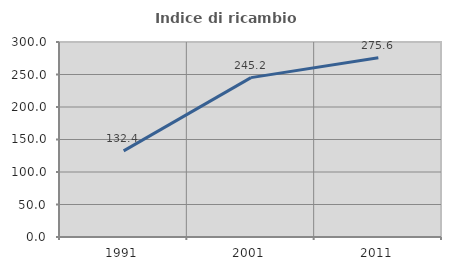
| Category | Indice di ricambio occupazionale  |
|---|---|
| 1991.0 | 132.425 |
| 2001.0 | 245.208 |
| 2011.0 | 275.626 |